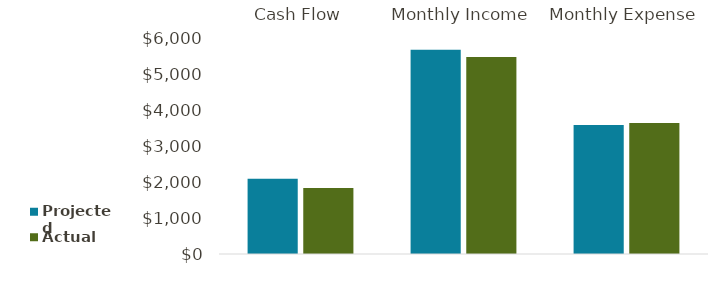
| Category | Projected | Actual |
|---|---|---|
| Cash Flow | 2097 | 1845 |
| Monthly Income | 5700 | 5500 |
| Monthly Expense | 3603 | 3655 |